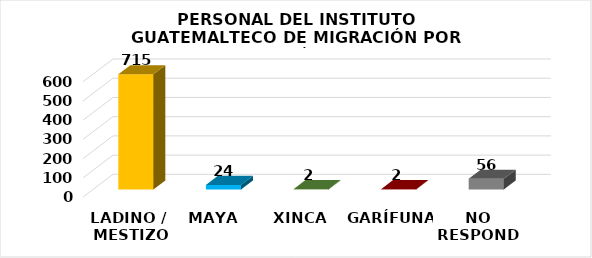
| Category | Series 0 |
|---|---|
| LADINO /
 MESTIZO | 715 |
| MAYA | 24 |
| XINCA | 2 |
| GARÍFUNA | 2 |
| NO RESPONDE | 56 |